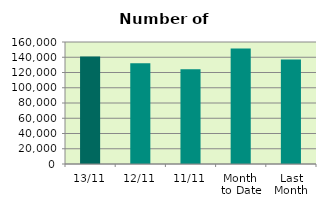
| Category | Series 0 |
|---|---|
| 13/11 | 140862 |
| 12/11 | 132026 |
| 11/11 | 124246 |
| Month 
to Date | 151383.556 |
| Last
Month | 137122.087 |